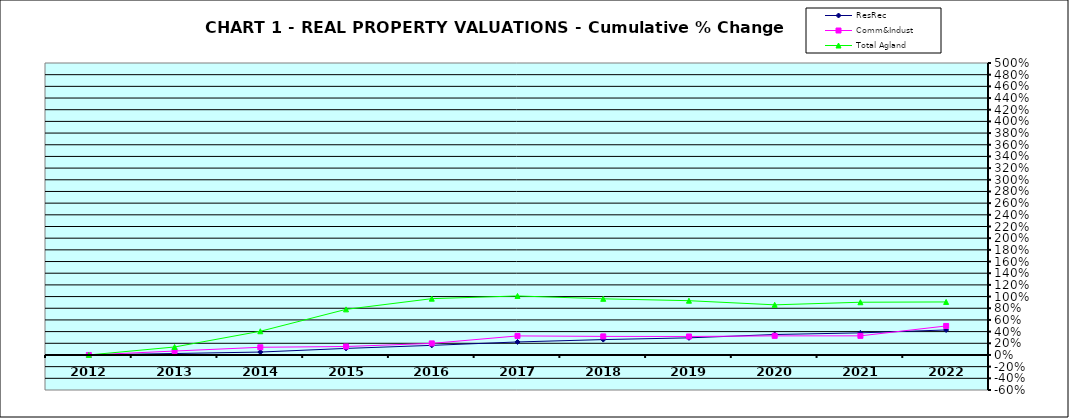
| Category | ResRec | Comm&Indust | Total Agland |
|---|---|---|---|
| 2012.0 | 0 | 0 | 0 |
| 2013.0 | 0.025 | 0.067 | 0.137 |
| 2014.0 | 0.05 | 0.132 | 0.406 |
| 2015.0 | 0.112 | 0.145 | 0.781 |
| 2016.0 | 0.164 | 0.198 | 0.964 |
| 2017.0 | 0.223 | 0.326 | 1.011 |
| 2018.0 | 0.263 | 0.318 | 0.962 |
| 2019.0 | 0.293 | 0.317 | 0.929 |
| 2020.0 | 0.35 | 0.327 | 0.859 |
| 2021.0 | 0.379 | 0.327 | 0.903 |
| 2022.0 | 0.428 | 0.497 | 0.908 |